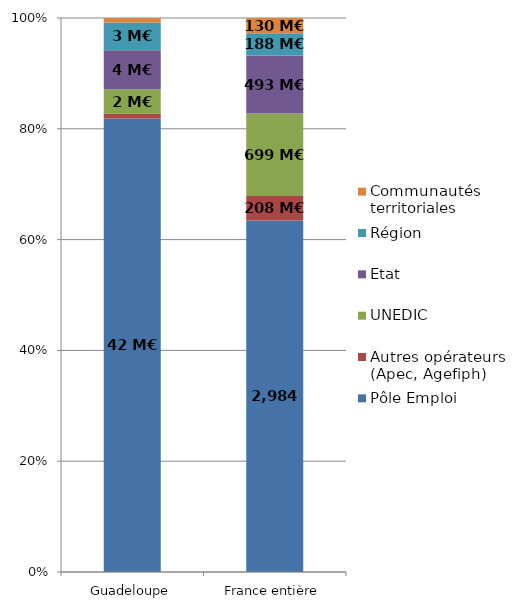
| Category | Pôle Emploi | Autres opérateurs (Apec, Agefiph) | UNEDIC | Etat | Région | Communautés territoriales |
|---|---|---|---|---|---|---|
| Guadeloupe | 42.162 | 0.434 | 2.264 | 3.645 | 2.573 | 0.413 |
| France entière | 2983.694 | 207.577 | 699.479 | 493.308 | 188.079 | 129.71 |